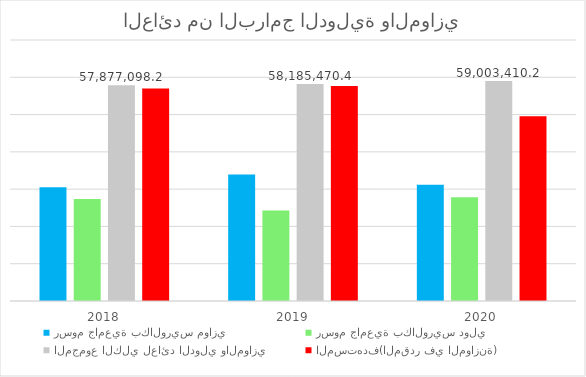
| Category | رسوم جامعية بكالوريس موازي  | رسوم جامعية بكالوريس دولي  | المجموع الكلي لعائد الدولي والموازي | المستهدف(المقدر في الموازنة) |
|---|---|---|---|---|
| 2018.0 | 30525393.826 | 27351704.405 | 57877098.231 | 57005000 |
| 2019.0 | 33910708.12 | 24274762.285 | 58185470.405 | 57695000 |
| 2020.0 | 31190466.97 | 27812943.226 | 59003410.196 | 49580000 |